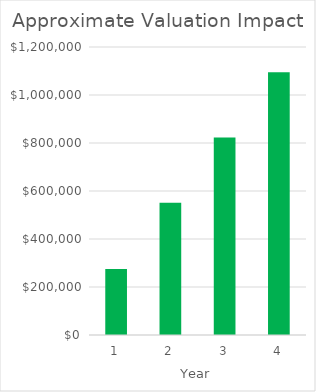
| Category | Series 1 |
|---|---|
| 0 | 274580.375 |
| 1 | 551321.781 |
| 2 | 822924.312 |
| 3 | 1094444.812 |